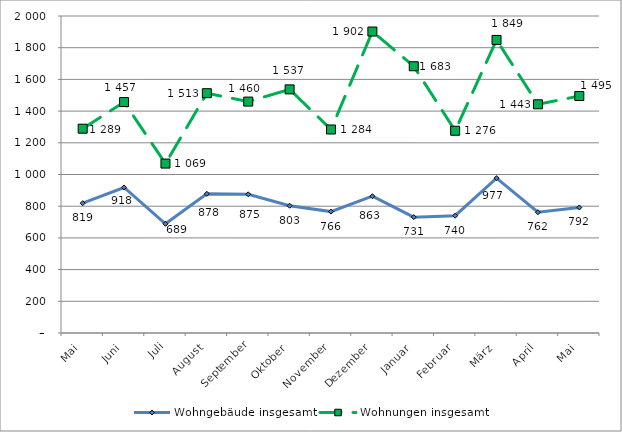
| Category | Wohngebäude insgesamt | Wohnungen insgesamt |
|---|---|---|
| Mai | 819 | 1289 |
| Juni | 918 | 1457 |
| Juli | 689 | 1069 |
| August | 878 | 1513 |
| September | 875 | 1460 |
| Oktober | 803 | 1537 |
| November | 766 | 1284 |
| Dezember | 863 | 1902 |
| Januar | 731 | 1683 |
| Februar | 740 | 1276 |
| März | 977 | 1849 |
| April | 762 | 1443 |
| Mai | 792 | 1495 |